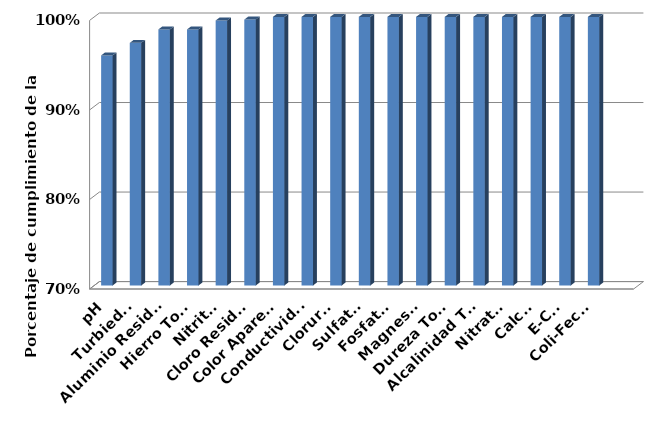
| Category | Series 0 |
|---|---|
| pH | 0.957 |
| Turbiedad | 0.971 |
| Aluminio Residual | 0.986 |
| Hierro Total | 0.986 |
| Nitritos | 0.996 |
| Cloro Residual | 0.997 |
| Color Aparente | 1 |
| Conductividad | 1 |
| Cloruros | 1 |
| Sulfatos | 1 |
| Fosfatos | 1 |
| Magnesio | 1 |
| Dureza Total | 1 |
| Alcalinidad Total | 1 |
| Nitratos | 1 |
| Calcio | 1 |
| E-Coli | 1 |
| Coli-Fecal | 1 |